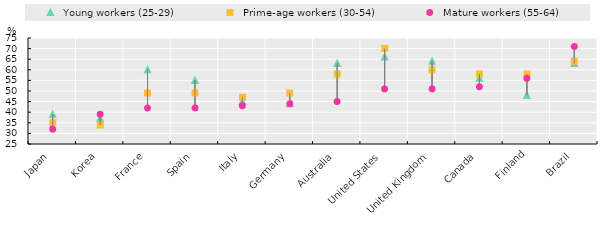
| Category |   Young workers (25-29) |   Prime-age workers (30-54) |   Mature workers (55-64) |
|---|---|---|---|
| Japan | 39 | 35 | 32 |
| Korea | 37 | 34 | 39 |
| France | 60 | 49 | 42 |
| Spain | 55 | 49 | 42 |
| Italy | 45 | 47 | 43 |
| Germany | 44 | 49 | 44 |
| Australia | 63 | 58 | 45 |
| United States | 66 | 70 | 51 |
| United Kingdom | 64 | 60 | 51 |
| Canada | 56 | 58 | 52 |
| Finland | 48 | 58 | 56 |
| Brazil | 63 | 64 | 71 |